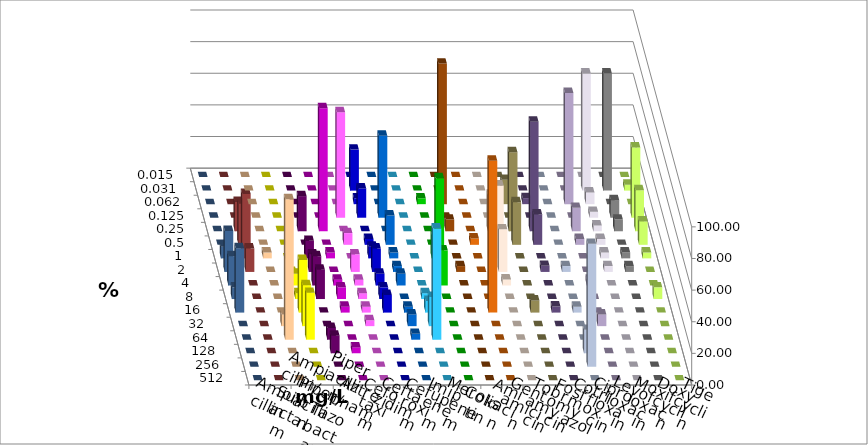
| Category | Ampicillin | Ampicillin/ Sulbactam | Piperacillin | Piperacillin/ Tazobactam | Aztreonam | Cefotaxim | Ceftazidim | Cefuroxim | Imipenem | Meropenem | Colistin | Amikacin | Gentamicin | Tobramycin | Fosfomycin | Cotrimoxazol | Ciprofloxacin | Levofloxacin | Moxifloxacin | Doxycyclin | Tigecyclin |
|---|---|---|---|---|---|---|---|---|---|---|---|---|---|---|---|---|---|---|---|---|---|
| 0.015 | 0 | 0 | 0 | 0 | 0 | 0 | 0 | 0 | 0 | 0 | 0 | 0 | 0 | 0 | 0 | 0 | 0 | 0 | 0 | 0 | 0 |
| 0.031 | 0 | 0 | 0 | 0 | 0 | 25.926 | 0 | 0 | 0 | 0 | 0 | 0 | 0 | 0 | 0 | 0 | 74.074 | 74.074 | 3.704 | 0 | 0 |
| 0.062 | 0 | 0 | 0 | 0 | 0 | 3.704 | 0 | 0 | 3.704 | 88.889 | 0 | 0 | 15.385 | 3.846 | 0 | 70.37 | 7.407 | 0 | 0 | 0 | 0 |
| 0.125 | 0 | 0 | 0 | 0 | 66.667 | 18.519 | 51.852 | 0 | 0 | 0 | 0 | 0 | 0 | 0 | 0 | 0 | 3.704 | 11.111 | 44.444 | 0 | 0 |
| 0.25 | 0 | 0 | 22.222 | 77.778 | 0 | 0 | 0 | 0 | 0 | 7.407 | 0 | 23.077 | 50 | 69.231 | 0 | 14.815 | 3.704 | 7.407 | 25.926 | 0 | 18.519 |
| 0.5 | 0 | 0 | 0 | 0 | 7.407 | 3.704 | 18.519 | 0 | 0 | 0 | 4 | 0 | 26.923 | 19.231 | 0 | 3.704 | 3.704 | 0 | 14.815 | 0 | 25.926 |
| 1.0 | 3.704 | 0 | 11.111 | 3.704 | 0 | 7.407 | 3.704 | 0 | 14.815 | 0 | 0 | 46.154 | 0 | 0 | 0 | 0 | 3.704 | 3.704 | 3.704 | 7.407 | 40.741 |
| 2.0 | 0 | 0 | 11.111 | 0 | 11.111 | 14.815 | 3.704 | 0 | 59.259 | 3.704 | 0 | 26.923 | 0 | 3.846 | 3.704 | 0 | 3.704 | 3.704 | 0 | 25.926 | 14.815 |
| 4.0 | 0 | 7.407 | 18.519 | 3.704 | 3.704 | 7.407 | 7.407 | 0 | 22.222 | 0 | 0 | 3.846 | 0 | 0 | 0 | 3.704 | 0 | 0 | 0 | 18.519 | 0 |
| 8.0 | 0 | 3.704 | 18.519 | 7.407 | 3.704 | 7.407 | 0 | 3.704 | 0 | 0 | 0 | 0 | 0 | 0 | 0 | 0 | 0 | 0 | 7.407 | 7.407 | 0 |
| 16.0 | 0 | 33.333 | 0 | 3.704 | 3.704 | 11.111 | 3.704 | 7.407 | 0 | 0 | 96 | 0 | 7.692 | 3.846 | 3.704 | 0 | 0 | 0 | 0 | 40.741 | 0 |
| 32.0 | 7.407 | 25.926 | 0 | 0 | 3.704 | 0 | 7.407 | 18.519 | 0 | 0 | 0 | 0 | 0 | 0 | 0 | 7.407 | 0 | 0 | 0 | 0 | 0 |
| 64.0 | 88.889 | 29.63 | 7.407 | 0 | 0 | 0 | 3.704 | 70.37 | 0 | 0 | 0 | 0 | 0 | 0 | 0 | 0 | 0 | 0 | 0 | 0 | 0 |
| 128.0 | 0 | 0 | 11.111 | 3.704 | 0 | 0 | 0 | 0 | 0 | 0 | 0 | 0 | 0 | 0 | 14.815 | 0 | 0 | 0 | 0 | 0 | 0 |
| 256.0 | 0 | 0 | 0 | 0 | 0 | 0 | 0 | 0 | 0 | 0 | 0 | 0 | 0 | 0 | 77.778 | 0 | 0 | 0 | 0 | 0 | 0 |
| 512.0 | 0 | 0 | 0 | 0 | 0 | 0 | 0 | 0 | 0 | 0 | 0 | 0 | 0 | 0 | 0 | 0 | 0 | 0 | 0 | 0 | 0 |